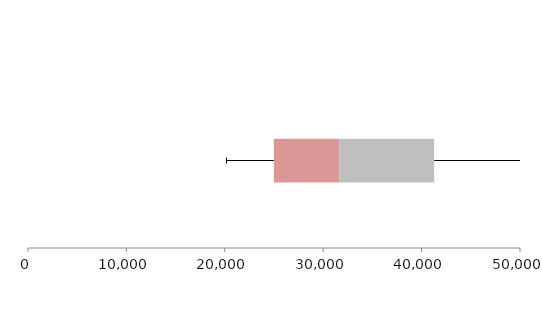
| Category | Series 1 | Series 2 | Series 3 |
|---|---|---|---|
| 0 | 24981.974 | 6661.41 | 9635.033 |